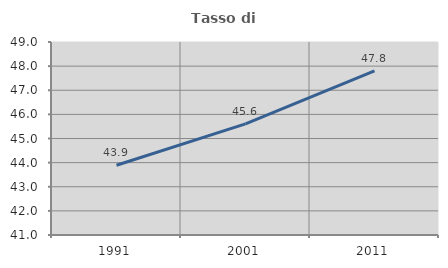
| Category | Tasso di occupazione   |
|---|---|
| 1991.0 | 43.889 |
| 2001.0 | 45.604 |
| 2011.0 | 47.805 |